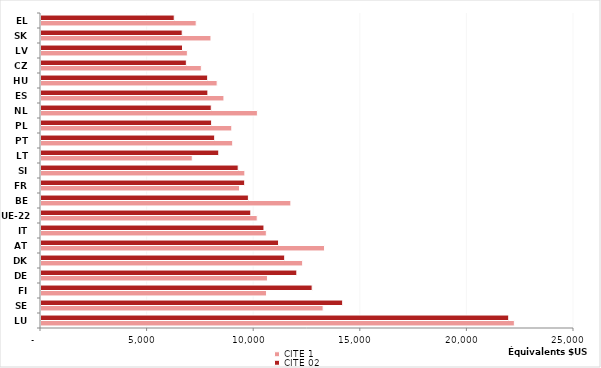
| Category | CITE 1 | CITE 02 |
|---|---|---|
| LU | 22203.32 | 21938.25 |
| SE | 13233.52 | 14149.75 |
| FI | 10575.51 | 12717.88 |
| DE | 10621.85 | 11999.67 |
| DK | 12273.18 | 11431.36 |
| AT | 13298.9 | 11142.79 |
| IT | 10569.57 | 10457.57 |
| UE-22 | 10141.153 | 9840.852 |
| BE | 11719.9 | 9727.958 |
| FR | 9311.521 | 9554.688 |
| SI | 9562.113 | 9249.402 |
| LT | 7095.386 | 8338.627 |
| PT | 8991.832 | 8147.375 |
| PL | 8948.665 | 8003.067 |
| NL | 10149.94 | 7985.496 |
| ES | 8580.329 | 7827.382 |
| HU | 8262.191 | 7817.993 |
| CZ | 7520.278 | 6817.86 |
| LV | 6865.037 | 6637.015 |
| SK | 7972.15 | 6623.21 |
| EL | 7279.261 | 6249.703 |